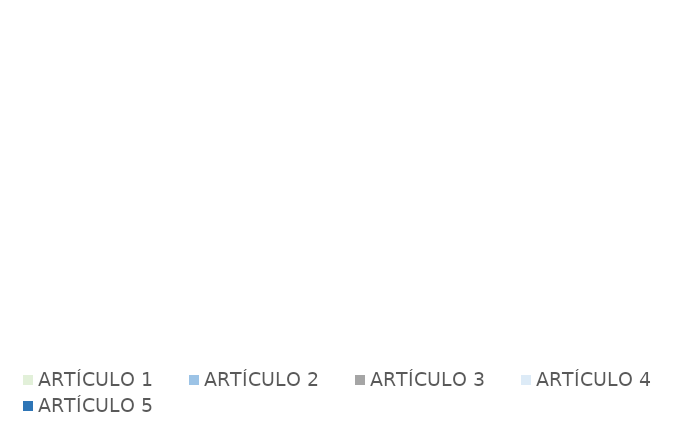
| Category | Series 0 |
|---|---|
| ARTÍCULO 1 | 0 |
| ARTÍCULO 2 | 0 |
| ARTÍCULO 3 | 0 |
| ARTÍCULO 4 | 0 |
| ARTÍCULO 5 | 0 |